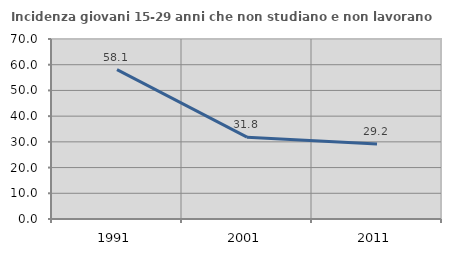
| Category | Incidenza giovani 15-29 anni che non studiano e non lavorano  |
|---|---|
| 1991.0 | 58.068 |
| 2001.0 | 31.818 |
| 2011.0 | 29.213 |